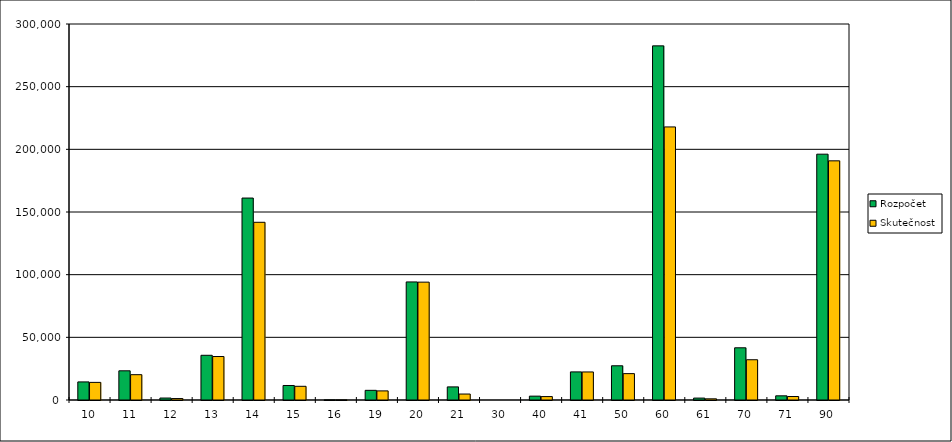
| Category | Rozpočet | Skutečnost |
|---|---|---|
| 10.0 | 14430.74 | 14050.63 |
| 11.0 | 23292.39 | 20207.39 |
| 12.0 | 1566.15 | 1156.83 |
| 13.0 | 35673.85 | 34688.33 |
| 14.0 | 161121.48 | 141786.67 |
| 15.0 | 11579.46 | 10932.89 |
| 16.0 | 103 | 77.19 |
| 19.0 | 7714.32 | 7262.12 |
| 20.0 | 94202.29 | 94026.63 |
| 21.0 | 10449.9 | 4761.23 |
| 30.0 | 0 | 0 |
| 40.0 | 3076.75 | 2728.39 |
| 41.0 | 22416.08 | 22377.44 |
| 50.0 | 27308.6 | 21033.77 |
| 60.0 | 282553.27 | 217872.01 |
| 61.0 | 1530.51 | 937.5 |
| 70.0 | 41653.11 | 32126.76 |
| 71.0 | 3336.75 | 2773.91 |
| 90.0 | 196136.24 | 190826.03 |